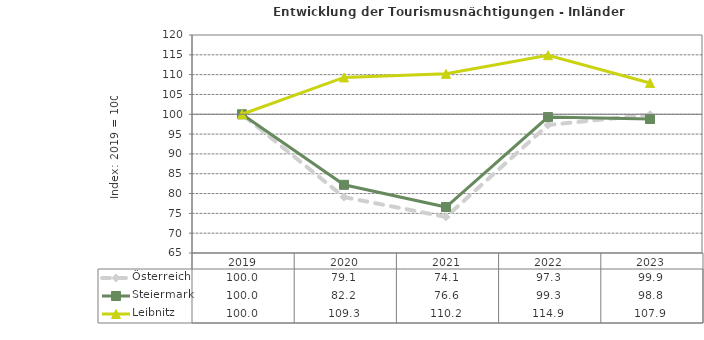
| Category | Österreich | Steiermark | Leibnitz |
|---|---|---|---|
| 2023.0 | 99.9 | 98.8 | 107.9 |
| 2022.0 | 97.3 | 99.3 | 114.9 |
| 2021.0 | 74.1 | 76.6 | 110.2 |
| 2020.0 | 79.1 | 82.2 | 109.3 |
| 2019.0 | 100 | 100 | 100 |